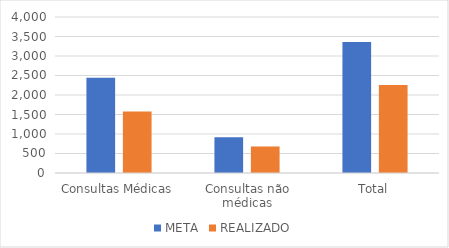
| Category | META | REALIZADO |
|---|---|---|
| Consultas Médicas | 2442 | 1578 |
| Consultas não médicas | 916 | 680 |
| Total | 3358 | 2258 |